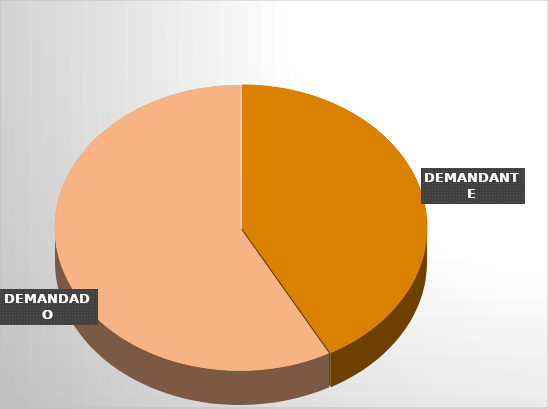
| Category | Series 0 | Series 1 |
|---|---|---|
| DEMANDANTE | 37 | 3373316136 |
| DEMANDADO | 51 | 2606568020933 |